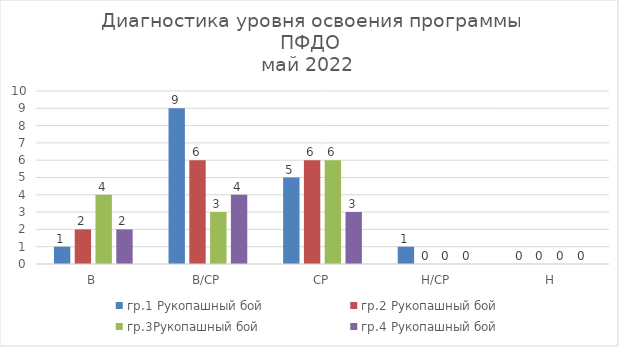
| Category | гр.1 Рукопашный бой | гр.2 Рукопашный бой | гр.3Рукопашный бой | гр.4 Рукопашный бой |
|---|---|---|---|---|
| В | 1 | 2 | 4 | 2 |
| В/СР | 9 | 6 | 3 | 4 |
| СР | 5 | 6 | 6 | 3 |
| Н/СР | 1 | 0 | 0 | 0 |
| Н | 0 | 0 | 0 | 0 |